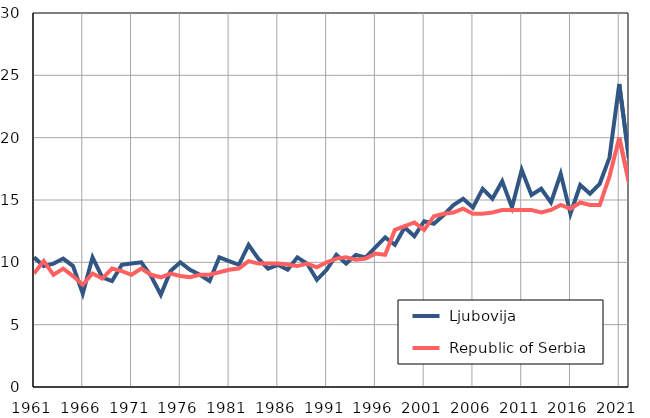
| Category |  Ljubovija |  Republic of Serbia |
|---|---|---|
| 1961.0 | 10.4 | 9.1 |
| 1962.0 | 9.7 | 10.1 |
| 1963.0 | 9.9 | 9 |
| 1964.0 | 10.3 | 9.5 |
| 1965.0 | 9.7 | 8.9 |
| 1966.0 | 7.5 | 8.2 |
| 1967.0 | 10.4 | 9.1 |
| 1968.0 | 8.8 | 8.7 |
| 1969.0 | 8.5 | 9.5 |
| 1970.0 | 9.8 | 9.3 |
| 1971.0 | 9.9 | 9 |
| 1972.0 | 10 | 9.5 |
| 1973.0 | 8.9 | 9 |
| 1974.0 | 7.4 | 8.8 |
| 1975.0 | 9.3 | 9.1 |
| 1976.0 | 10 | 8.9 |
| 1977.0 | 9.4 | 8.8 |
| 1978.0 | 9 | 9 |
| 1979.0 | 8.5 | 9 |
| 1980.0 | 10.4 | 9.2 |
| 1981.0 | 10.1 | 9.4 |
| 1982.0 | 9.8 | 9.5 |
| 1983.0 | 11.4 | 10.1 |
| 1984.0 | 10.3 | 9.9 |
| 1985.0 | 9.5 | 9.9 |
| 1986.0 | 9.8 | 9.9 |
| 1987.0 | 9.4 | 9.8 |
| 1988.0 | 10.4 | 9.7 |
| 1989.0 | 9.9 | 9.9 |
| 1990.0 | 8.6 | 9.6 |
| 1991.0 | 9.4 | 10 |
| 1992.0 | 10.6 | 10.3 |
| 1993.0 | 9.9 | 10.4 |
| 1994.0 | 10.6 | 10.2 |
| 1995.0 | 10.4 | 10.3 |
| 1996.0 | 11.2 | 10.7 |
| 1997.0 | 12 | 10.6 |
| 1998.0 | 11.4 | 12.6 |
| 1999.0 | 12.8 | 12.9 |
| 2000.0 | 12.1 | 13.2 |
| 2001.0 | 13.3 | 12.6 |
| 2002.0 | 13.1 | 13.7 |
| 2003.0 | 13.8 | 13.9 |
| 2004.0 | 14.6 | 14 |
| 2005.0 | 15.1 | 14.3 |
| 2006.0 | 14.4 | 13.9 |
| 2007.0 | 15.9 | 13.9 |
| 2008.0 | 15.1 | 14 |
| 2009.0 | 16.5 | 14.2 |
| 2010.0 | 14.4 | 14.2 |
| 2011.0 | 17.4 | 14.2 |
| 2012.0 | 15.4 | 14.2 |
| 2013.0 | 15.9 | 14 |
| 2014.0 | 14.8 | 14.2 |
| 2015.0 | 17.1 | 14.6 |
| 2016.0 | 13.9 | 14.3 |
| 2017.0 | 16.2 | 14.8 |
| 2018.0 | 15.5 | 14.6 |
| 2019.0 | 16.3 | 14.6 |
| 2020.0 | 18.4 | 16.9 |
| 2021.0 | 24.3 | 20 |
| 2022.0 | 18.3 | 16.4 |